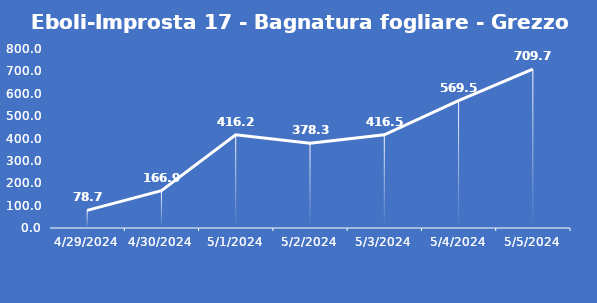
| Category | Eboli-Improsta 17 - Bagnatura fogliare - Grezzo (min) |
|---|---|
| 4/29/24 | 78.7 |
| 4/30/24 | 166.9 |
| 5/1/24 | 416.2 |
| 5/2/24 | 378.3 |
| 5/3/24 | 416.5 |
| 5/4/24 | 569.5 |
| 5/5/24 | 709.7 |